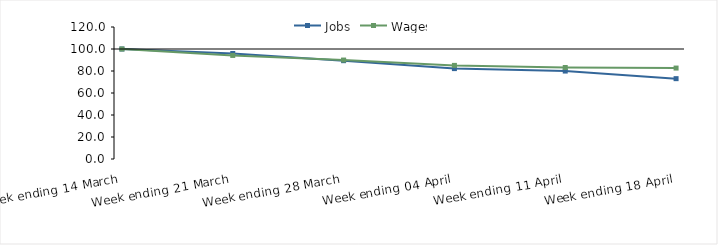
| Category | Jobs | Wages |
|---|---|---|
| 0 | 100 | 100 |
| 1900-01-01 | 95.925 | 94.151 |
| 1900-01-02 | 89.386 | 89.95 |
| 1900-01-03 | 82.18 | 85.097 |
| 1900-01-04 | 79.942 | 83.161 |
| 1900-01-05 | 73.041 | 82.665 |